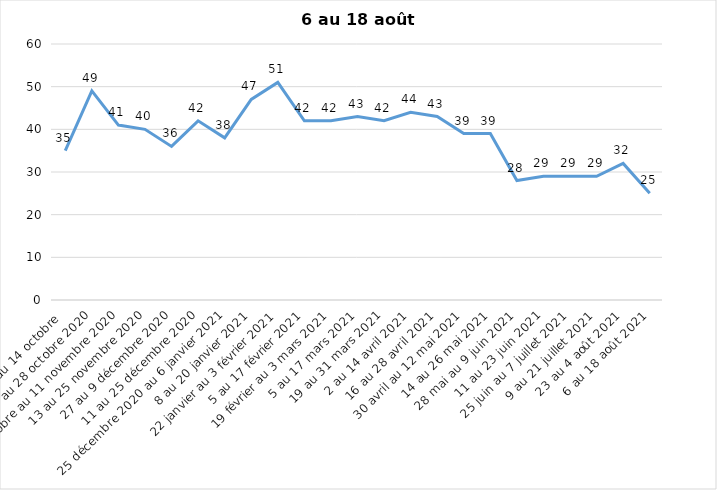
| Category | Toujours aux trois mesures |
|---|---|
| 2 au 14 octobre  | 35 |
| 16 au 28 octobre 2020 | 49 |
| 30 octobre au 11 novembre 2020 | 41 |
| 13 au 25 novembre 2020 | 40 |
| 27 au 9 décembre 2020 | 36 |
| 11 au 25 décembre 2020 | 42 |
| 25 décembre 2020 au 6 janvier 2021 | 38 |
| 8 au 20 janvier 2021 | 47 |
| 22 janvier au 3 février 2021 | 51 |
| 5 au 17 février 2021 | 42 |
| 19 février au 3 mars 2021 | 42 |
| 5 au 17 mars 2021 | 43 |
| 19 au 31 mars 2021 | 42 |
| 2 au 14 avril 2021 | 44 |
| 16 au 28 avril 2021 | 43 |
| 30 avril au 12 mai 2021 | 39 |
| 14 au 26 mai 2021 | 39 |
| 28 mai au 9 juin 2021 | 28 |
| 11 au 23 juin 2021 | 29 |
| 25 juin au 7 juillet 2021 | 29 |
| 9 au 21 juillet 2021 | 29 |
| 23 au 4 août 2021 | 32 |
| 6 au 18 août 2021 | 25 |